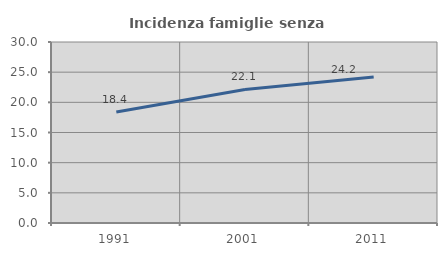
| Category | Incidenza famiglie senza nuclei |
|---|---|
| 1991.0 | 18.399 |
| 2001.0 | 22.142 |
| 2011.0 | 24.199 |